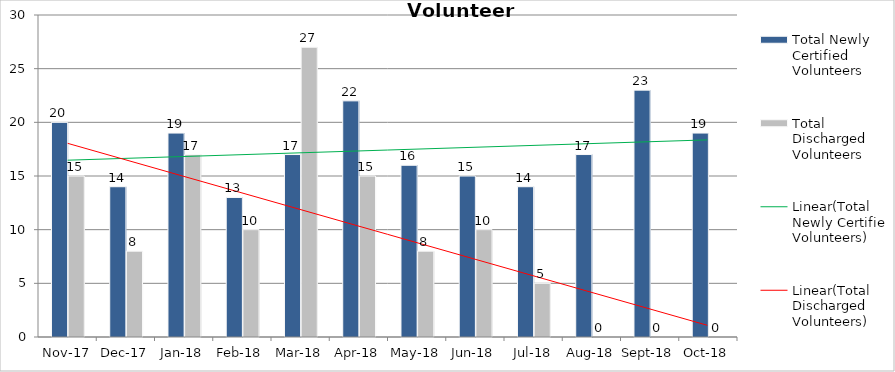
| Category | Total Newly Certified Volunteers | Total Discharged Volunteers |
|---|---|---|
| 2017-11-01 | 20 | 15 |
| 2017-12-01 | 14 | 8 |
| 2018-01-01 | 19 | 17 |
| 2018-02-01 | 13 | 10 |
| 2018-03-01 | 17 | 27 |
| 2018-04-01 | 22 | 15 |
| 2018-05-01 | 16 | 8 |
| 2018-06-01 | 15 | 10 |
| 2018-07-01 | 14 | 5 |
| 2018-08-01 | 17 | 0 |
| 2018-09-01 | 23 | 0 |
| 2018-10-01 | 19 | 0 |